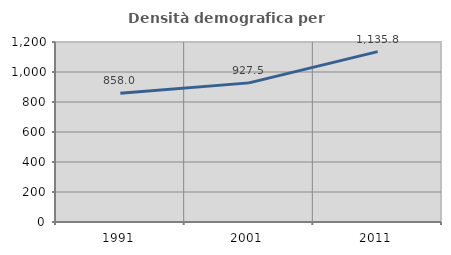
| Category | Densità demografica |
|---|---|
| 1991.0 | 858.049 |
| 2001.0 | 927.515 |
| 2011.0 | 1135.773 |